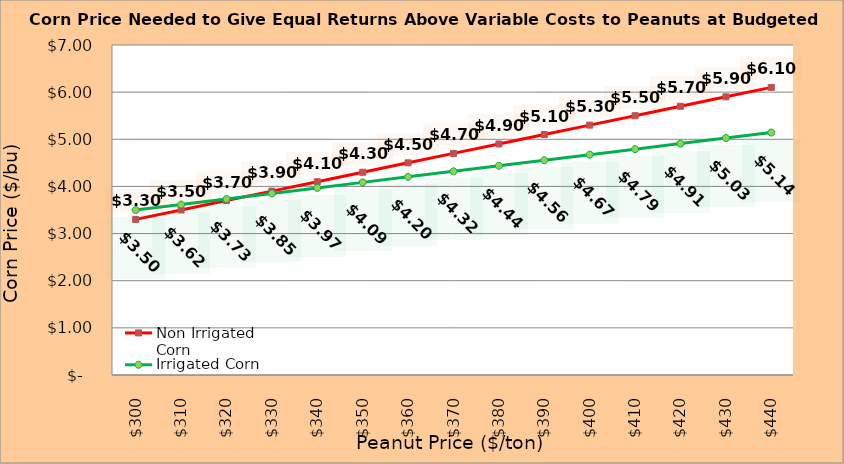
| Category | Non Irrigated Corn | Irrigated Corn |
|---|---|---|
| 299.8936170212766 | 3.301 | 3.498 |
| 309.8936170212766 | 3.501 | 3.616 |
| 319.8936170212766 | 3.701 | 3.733 |
| 329.8936170212766 | 3.901 | 3.851 |
| 339.8936170212766 | 4.101 | 3.968 |
| 349.8936170212766 | 4.301 | 4.086 |
| 359.8936170212766 | 4.501 | 4.203 |
| 369.8936170212766 | 4.701 | 4.321 |
| 379.8936170212766 | 4.901 | 4.438 |
| 389.8936170212766 | 5.101 | 4.556 |
| 399.8936170212766 | 5.301 | 4.673 |
| 409.8936170212766 | 5.501 | 4.791 |
| 419.8936170212766 | 5.701 | 4.908 |
| 429.8936170212766 | 5.901 | 5.026 |
| 439.8936170212766 | 6.101 | 5.143 |